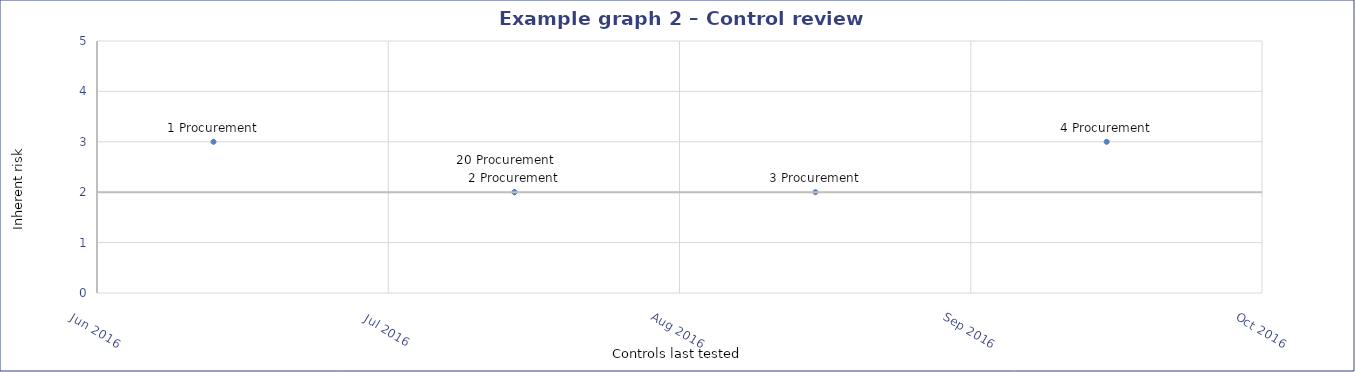
| Category | Inherent rating |
|---|---|
| 42583.0 | 2 |
| 42614.0 | 2 |
| 42583.0 | 2 |
| 42552.0 | 3 |
| 42644.0 | 3 |